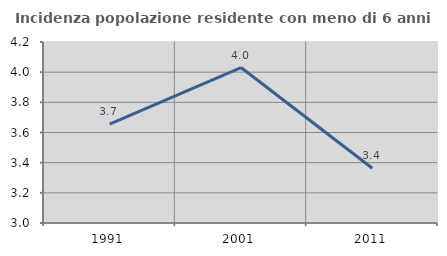
| Category | Incidenza popolazione residente con meno di 6 anni |
|---|---|
| 1991.0 | 3.656 |
| 2001.0 | 4.031 |
| 2011.0 | 3.363 |